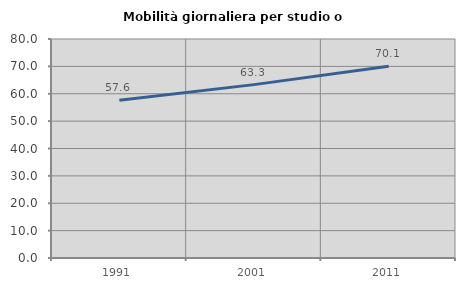
| Category | Mobilità giornaliera per studio o lavoro |
|---|---|
| 1991.0 | 57.646 |
| 2001.0 | 63.335 |
| 2011.0 | 70.079 |